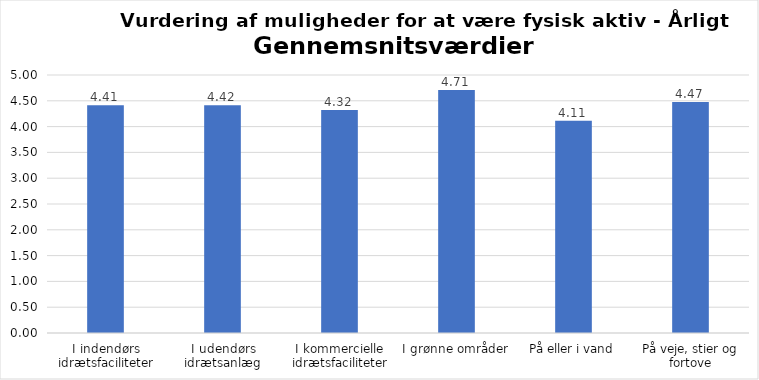
| Category | Gennemsnit |
|---|---|
| I indendørs idrætsfaciliteter | 4.414 |
| I udendørs idrætsanlæg | 4.416 |
| I kommercielle idrætsfaciliteter | 4.322 |
| I grønne områder | 4.709 |
| På eller i vand | 4.115 |
| På veje, stier og fortove | 4.474 |